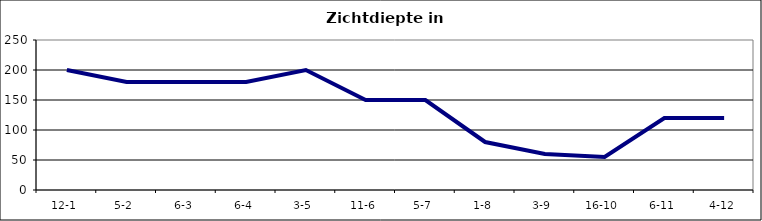
| Category | Zichtdiepte in cm |
|---|---|
| 12-1 | 200 |
| 5-2 | 180 |
| 6-3 | 180 |
| 6-4 | 180 |
| 3-5 | 200 |
| 11-6 | 150 |
| 5-7 | 150 |
| 1-8 | 80 |
| 3-9 | 60 |
| 16-10 | 55 |
| 6-11 | 120 |
| 4-12 | 120 |